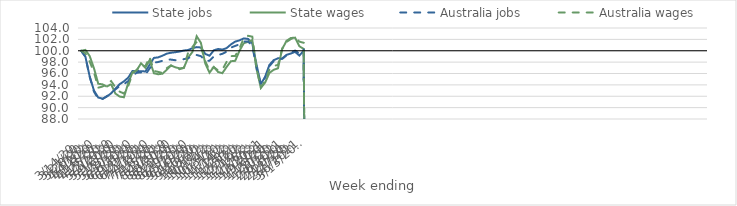
| Category | State jobs | State wages | Australia jobs | Australia wages |
|---|---|---|---|---|
| 14/03/2020 | 100 | 100 | 100 | 100 |
| 21/03/2020 | 98.946 | 100.146 | 98.956 | 99.571 |
| 28/03/2020 | 95.475 | 99.065 | 95.411 | 98.095 |
| 04/04/2020 | 92.998 | 96.912 | 92.814 | 96.217 |
| 11/04/2020 | 91.775 | 94.194 | 91.522 | 93.51 |
| 18/04/2020 | 91.58 | 94.092 | 91.499 | 93.706 |
| 25/04/2020 | 91.928 | 93.692 | 92.024 | 94.115 |
| 02/05/2020 | 92.511 | 94.131 | 92.518 | 94.669 |
| 09/05/2020 | 93.325 | 92.477 | 93.198 | 93.587 |
| 16/05/2020 | 94.124 | 91.946 | 93.789 | 92.821 |
| 23/05/2020 | 94.627 | 91.82 | 94.145 | 92.476 |
| 30/05/2020 | 95.273 | 94.308 | 94.654 | 93.783 |
| 06/06/2020 | 96.438 | 96.214 | 95.642 | 95.969 |
| 13/06/2020 | 96.434 | 96.57 | 96.146 | 96.63 |
| 20/06/2020 | 96.403 | 97.799 | 96.166 | 97.54 |
| 27/06/2020 | 96.359 | 97.002 | 95.757 | 97.254 |
| 04/07/2020 | 97.532 | 98.346 | 96.891 | 98.931 |
| 11/07/2020 | 98.741 | 96.048 | 97.918 | 96.452 |
| 18/07/2020 | 98.837 | 95.865 | 98.015 | 96.287 |
| 25/07/2020 | 99.129 | 95.968 | 98.234 | 96.104 |
| 01/08/2020 | 99.49 | 96.638 | 98.45 | 96.943 |
| 08/08/2020 | 99.653 | 97.413 | 98.442 | 97.412 |
| 15/08/2020 | 99.74 | 97.096 | 98.335 | 96.914 |
| 22/08/2020 | 99.857 | 96.911 | 98.39 | 96.757 |
| 29/08/2020 | 100.046 | 96.983 | 98.521 | 96.978 |
| 05/09/2020 | 100.126 | 98.799 | 98.687 | 99.677 |
| 12/09/2020 | 100.452 | 99.774 | 99.091 | 100.68 |
| 19/09/2020 | 100.64 | 102.554 | 99.254 | 101.536 |
| 26/09/2020 | 100.572 | 101.37 | 99.049 | 100.689 |
| 03/10/2020 | 99.448 | 97.778 | 98.196 | 98.175 |
| 10/10/2020 | 99.129 | 96.145 | 98.237 | 96.534 |
| 17/10/2020 | 100.072 | 97.152 | 98.99 | 97.113 |
| 24/10/2020 | 100.312 | 96.269 | 99.254 | 96.552 |
| 31/10/2020 | 100.212 | 96.059 | 99.461 | 96.668 |
| 07/11/2020 | 100.467 | 97.152 | 99.844 | 98.053 |
| 14/11/2020 | 101.11 | 98.157 | 100.553 | 99.053 |
| 21/11/2020 | 101.607 | 98.225 | 100.846 | 99.075 |
| 28/11/2020 | 101.825 | 99.981 | 101.126 | 100.407 |
| 05/12/2020 | 102.167 | 101.318 | 101.622 | 102.179 |
| 12/12/2020 | 102.089 | 101.577 | 101.647 | 102.628 |
| 19/12/2020 | 101.295 | 101.884 | 100.808 | 102.478 |
| 26/12/2020 | 97.502 | 96.766 | 96.977 | 96.957 |
| 02/01/2021 | 94.138 | 93.468 | 94.05 | 93.527 |
| 09/01/2021 | 95.427 | 94.408 | 95.274 | 94.722 |
| 16/01/2021 | 97.512 | 96.104 | 97.292 | 96.737 |
| 23/01/2021 | 98.344 | 96.655 | 98.18 | 97.336 |
| 30/01/2021 | 98.671 | 96.916 | 98.522 | 97.507 |
| 06/02/2021 | 98.645 | 100.321 | 98.581 | 100.419 |
| 13/02/2021 | 99.28 | 101.748 | 99.185 | 101.54 |
| 20/02/2021 | 99.511 | 102.241 | 99.643 | 102.046 |
| 27/02/2021 | 99.805 | 102.306 | 100.036 | 102.451 |
| 06/03/2021 | 99.155 | 100.791 | 99.503 | 101.603 |
| 13/03/2021 | 99.985 | 100.325 | 100.244 | 101.4 |